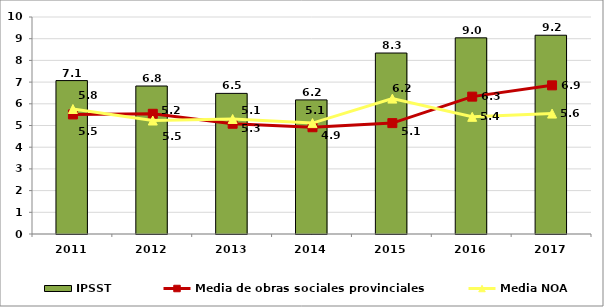
| Category | IPSST |
|---|---|
| 2011.0 | 7.07 |
| 2012.0 | 6.82 |
| 2013.0 | 6.48 |
| 2014.0 | 6.18 |
| 2015.0 | 8.34 |
| 2016.0 | 9.04 |
| 2017.0 | 9.16 |